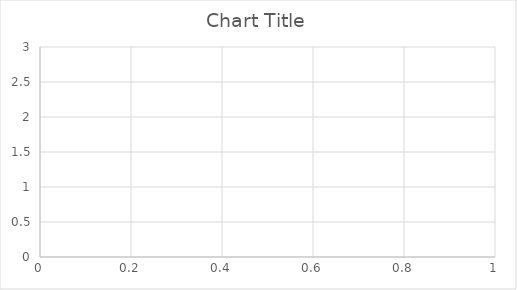
| Category | Series 0 |
|---|---|
| 0 | 2 |
| 1 | 2 |
| 2 | 2.333 |
| 3 | 2.25 |
| 4 | 2.4 |
| 5 | 2.167 |
| 6 | 2 |
| 7 | 2 |
| 8 | 1.889 |
| 9 | 1.8 |
| 10 | 1.909 |
| 11 | 1.917 |
| 12 | 1.846 |
| 13 | 1.786 |
| 14 | 1.733 |
| 15 | 1.688 |
| 16 | 1.647 |
| 17 | 1.611 |
| 18 | 1.579 |
| 19 | 1.6 |
| 20 | 1.667 |
| 21 | 1.636 |
| 22 | 1.696 |
| 23 | 1.667 |
| 24 | 1.64 |
| 25 | 1.615 |
| 26 | 1.593 |
| 27 | 1.571 |
| 28 | 1.552 |
| 29 | 1.533 |
| 30 | 1.516 |
| 31 | 1.5 |
| 32 | 1.485 |
| 33 | 1.471 |
| 34 | 1.486 |
| 35 | 1.5 |
| 36 | 1.541 |
| 37 | 1.526 |
| 38 | 1.564 |
| 39 | 1.575 |
| 40 | 1.61 |
| 41 | 1.619 |
| 42 | 1.628 |
| 43 | 1.636 |
| 44 | 1.622 |
| 45 | 1.652 |
| 46 | 1.638 |
| 47 | 1.625 |
| 48 | 1.633 |
| 49 | 1.64 |
| 50 | 1.627 |
| 51 | 1.615 |
| 52 | 1.604 |
| 53 | 1.611 |
| 54 | 1.636 |
| 55 | 1.643 |
| 56 | 1.649 |
| 57 | 1.638 |
| 58 | 1.644 |
| 59 | 1.633 |
| 60 | 1.656 |
| 61 | 1.645 |
| 62 | 1.635 |
| 63 | 1.641 |
| 64 | 1.631 |
| 65 | 1.621 |
| 66 | 1.612 |
| 67 | 1.632 |
| 68 | 1.638 |
| 69 | 1.629 |
| 70 | 1.62 |
| 71 | 1.611 |
| 72 | 1.603 |
| 73 | 1.595 |
| 74 | 1.613 |
| 75 | 1.632 |
| 76 | 1.623 |
| 77 | 1.615 |
| 78 | 1.633 |
| 79 | 1.638 |
| 80 | 1.63 |
| 81 | 1.646 |
| 82 | 1.663 |
| 83 | 1.679 |
| 84 | 1.671 |
| 85 | 1.674 |
| 86 | 1.678 |
| 87 | 1.682 |
| 88 | 1.697 |
| 89 | 1.7 |
| 90 | 1.692 |
| 91 | 1.685 |
| 92 | 1.677 |
| 93 | 1.691 |
| 94 | 1.705 |
| 95 | 1.698 |
| 96 | 1.691 |
| 97 | 1.684 |
| 98 | 1.687 |
| 99 | 1.68 |
| 100 | 1.673 |
| 101 | 1.667 |
| 102 | 1.66 |
| 103 | 1.654 |
| 104 | 1.667 |
| 105 | 1.67 |
| 106 | 1.664 |
| 107 | 1.667 |
| 108 | 1.67 |
| 109 | 1.664 |
| 110 | 1.658 |
| 111 | 1.661 |
| 112 | 1.664 |
| 113 | 1.658 |
| 114 | 1.661 |
| 115 | 1.655 |
| 116 | 1.65 |
| 117 | 1.644 |
| 118 | 1.639 |
| 119 | 1.65 |
| 120 | 1.645 |
| 121 | 1.656 |
| 122 | 1.65 |
| 123 | 1.645 |
| 124 | 1.64 |
| 125 | 1.635 |
| 126 | 1.646 |
| 127 | 1.656 |
| 128 | 1.659 |
| 129 | 1.669 |
| 130 | 1.664 |
| 131 | 1.674 |
| 132 | 1.677 |
| 133 | 1.679 |
| 134 | 1.674 |
| 135 | 1.684 |
| 136 | 1.686 |
| 137 | 1.681 |
| 138 | 1.676 |
| 139 | 1.671 |
| 140 | 1.667 |
| 141 | 1.662 |
| 142 | 1.657 |
| 143 | 1.653 |
| 144 | 1.655 |
| 145 | 1.664 |
| 146 | 1.667 |
| 147 | 1.662 |
| 148 | 1.658 |
| 149 | 1.653 |
| 150 | 1.662 |
| 151 | 1.658 |
| 152 | 1.654 |
| 153 | 1.662 |
| 154 | 1.665 |
| 155 | 1.673 |
| 156 | 1.669 |
| 157 | 1.671 |
| 158 | 1.679 |
| 159 | 1.681 |
| 160 | 1.683 |
| 161 | 1.691 |
| 162 | 1.687 |
| 163 | 1.689 |
| 164 | 1.697 |
| 165 | 1.693 |
| 166 | 1.701 |
| 167 | 1.696 |
| 168 | 1.698 |
| 169 | 1.694 |
| 170 | 1.69 |
| 171 | 1.692 |
| 172 | 1.694 |
| 173 | 1.69 |
| 174 | 1.686 |
| 175 | 1.688 |
| 176 | 1.695 |
| 177 | 1.702 |
| 178 | 1.704 |
| 179 | 1.711 |
| 180 | 1.707 |
| 181 | 1.714 |
| 182 | 1.716 |
| 183 | 1.712 |
| 184 | 1.719 |
| 185 | 1.726 |
| 186 | 1.733 |
| 187 | 1.739 |
| 188 | 1.746 |
| 189 | 1.742 |
| 190 | 1.738 |
| 191 | 1.745 |
| 192 | 1.746 |
| 193 | 1.753 |
| 194 | 1.754 |
| 195 | 1.755 |
| 196 | 1.751 |
| 197 | 1.753 |
| 198 | 1.754 |
| 199 | 1.75 |
| 200 | 1.746 |
| 201 | 1.752 |
| 202 | 1.754 |
| 203 | 1.75 |
| 204 | 1.746 |
| 205 | 1.748 |
| 206 | 1.749 |
| 207 | 1.75 |
| 208 | 1.751 |
| 209 | 1.748 |
| 210 | 1.749 |
| 211 | 1.75 |
| 212 | 1.746 |
| 213 | 1.743 |
| 214 | 1.74 |
| 215 | 1.745 |
| 216 | 1.751 |
| 217 | 1.757 |
| 218 | 1.753 |
| 219 | 1.75 |
| 220 | 1.756 |
| 221 | 1.752 |
| 222 | 1.749 |
| 223 | 1.75 |
| 224 | 1.747 |
| 225 | 1.748 |
| 226 | 1.749 |
| 227 | 1.746 |
| 228 | 1.747 |
| 229 | 1.752 |
| 230 | 1.753 |
| 231 | 1.759 |
| 232 | 1.76 |
| 233 | 1.765 |
| 234 | 1.762 |
| 235 | 1.763 |
| 236 | 1.768 |
| 237 | 1.765 |
| 238 | 1.762 |
| 239 | 1.762 |
| 240 | 1.759 |
| 241 | 1.764 |
| 242 | 1.765 |
| 243 | 1.766 |
| 244 | 1.767 |
| 245 | 1.768 |
| 246 | 1.769 |
| 247 | 1.766 |
| 248 | 1.771 |
| 249 | 1.772 |
| 250 | 1.777 |
| 251 | 1.782 |
| 252 | 1.783 |
| 253 | 1.783 |
| 254 | 1.78 |
| 255 | 1.777 |
| 256 | 1.782 |
| 257 | 1.787 |
| 258 | 1.784 |
| 259 | 1.781 |
| 260 | 1.785 |
| 261 | 1.79 |
| 262 | 1.791 |
| 263 | 1.795 |
| 264 | 1.796 |
| 265 | 1.797 |
| 266 | 1.794 |
| 267 | 1.799 |
| 268 | 1.796 |
| 269 | 1.793 |
| 270 | 1.79 |
| 271 | 1.794 |
| 272 | 1.795 |
| 273 | 1.796 |
| 274 | 1.793 |
| 275 | 1.79 |
| 276 | 1.791 |
| 277 | 1.791 |
| 278 | 1.792 |
| 279 | 1.789 |
| 280 | 1.79 |
| 281 | 1.787 |
| 282 | 1.788 |
| 283 | 1.792 |
| 284 | 1.796 |
| 285 | 1.794 |
| 286 | 1.791 |
| 287 | 1.792 |
| 288 | 1.792 |
| 289 | 1.79 |
| 290 | 1.794 |
| 291 | 1.798 |
| 292 | 1.799 |
| 293 | 1.796 |
| 294 | 1.793 |
| 295 | 1.794 |
| 296 | 1.795 |
| 297 | 1.795 |
| 298 | 1.793 |
| 299 | 1.79 |
| 300 | 1.791 |
| 301 | 1.788 |
| 302 | 1.789 |
| 303 | 1.789 |
| 304 | 1.787 |
| 305 | 1.784 |
| 306 | 1.782 |
| 307 | 1.782 |
| 308 | 1.786 |
| 309 | 1.79 |
| 310 | 1.791 |
| 311 | 1.792 |
| 312 | 1.789 |
| 313 | 1.79 |
| 314 | 1.79 |
| 315 | 1.788 |
| 316 | 1.785 |
| 317 | 1.786 |
| 318 | 1.784 |
| 319 | 1.781 |
| 320 | 1.782 |
| 321 | 1.78 |
| 322 | 1.777 |
| 323 | 1.775 |
| 324 | 1.775 |
| 325 | 1.773 |
| 326 | 1.771 |
| 327 | 1.771 |
| 328 | 1.772 |
| 329 | 1.773 |
| 330 | 1.773 |
| 331 | 1.771 |
| 332 | 1.775 |
| 333 | 1.775 |
| 334 | 1.773 |
| 335 | 1.774 |
| 336 | 1.772 |
| 337 | 1.769 |
| 338 | 1.77 |
| 339 | 1.768 |
| 340 | 1.765 |
| 341 | 1.766 |
| 342 | 1.77 |
| 343 | 1.767 |
| 344 | 1.765 |
| 345 | 1.766 |
| 346 | 1.764 |
| 347 | 1.761 |
| 348 | 1.762 |
| 349 | 1.76 |
| 350 | 1.758 |
| 351 | 1.759 |
| 352 | 1.762 |
| 353 | 1.76 |
| 354 | 1.763 |
| 355 | 1.767 |
| 356 | 1.768 |
| 357 | 1.768 |
| 358 | 1.766 |
| 359 | 1.764 |
| 360 | 1.767 |
| 361 | 1.765 |
| 362 | 1.766 |
| 363 | 1.769 |
| 364 | 1.767 |
| 365 | 1.768 |
| 366 | 1.768 |
| 367 | 1.766 |
| 368 | 1.764 |
| 369 | 1.765 |
| 370 | 1.763 |
| 371 | 1.761 |
| 372 | 1.761 |
| 373 | 1.762 |
| 374 | 1.765 |
| 375 | 1.769 |
| 376 | 1.769 |
| 377 | 1.772 |
| 378 | 1.773 |
| 379 | 1.774 |
| 380 | 1.777 |
| 381 | 1.775 |
| 382 | 1.773 |
| 383 | 1.773 |
| 384 | 1.771 |
| 385 | 1.769 |
| 386 | 1.767 |
| 387 | 1.771 |
| 388 | 1.769 |
| 389 | 1.767 |
| 390 | 1.765 |
| 391 | 1.765 |
| 392 | 1.768 |
| 393 | 1.772 |
| 394 | 1.77 |
| 395 | 1.77 |
| 396 | 1.768 |
| 397 | 1.769 |
| 398 | 1.769 |
| 399 | 1.768 |
| 400 | 1.768 |
| 401 | 1.769 |
| 402 | 1.767 |
| 403 | 1.767 |
| 404 | 1.765 |
| 405 | 1.764 |
| 406 | 1.764 |
| 407 | 1.767 |
| 408 | 1.768 |
| 409 | 1.766 |
| 410 | 1.764 |
| 411 | 1.762 |
| 412 | 1.763 |
| 413 | 1.761 |
| 414 | 1.759 |
| 415 | 1.757 |
| 416 | 1.755 |
| 417 | 1.754 |
| 418 | 1.752 |
| 419 | 1.75 |
| 420 | 1.748 |
| 421 | 1.749 |
| 422 | 1.749 |
| 423 | 1.75 |
| 424 | 1.748 |
| 425 | 1.746 |
| 426 | 1.749 |
| 427 | 1.75 |
| 428 | 1.748 |
| 429 | 1.749 |
| 430 | 1.747 |
| 431 | 1.75 |
| 432 | 1.748 |
| 433 | 1.747 |
| 434 | 1.747 |
| 435 | 1.745 |
| 436 | 1.746 |
| 437 | 1.744 |
| 438 | 1.743 |
| 439 | 1.745 |
| 440 | 1.744 |
| 441 | 1.742 |
| 442 | 1.743 |
| 443 | 1.745 |
| 444 | 1.744 |
| 445 | 1.742 |
| 446 | 1.74 |
| 447 | 1.739 |
| 448 | 1.742 |
| 449 | 1.74 |
| 450 | 1.738 |
| 451 | 1.737 |
| 452 | 1.74 |
| 453 | 1.738 |
| 454 | 1.738 |
| 455 | 1.737 |
| 456 | 1.737 |
| 457 | 1.74 |
| 458 | 1.739 |
| 459 | 1.739 |
| 460 | 1.738 |
| 461 | 1.738 |
| 462 | 1.737 |
| 463 | 1.739 |
| 464 | 1.742 |
| 465 | 1.74 |
| 466 | 1.739 |
| 467 | 1.739 |
| 468 | 1.742 |
| 469 | 1.745 |
| 470 | 1.743 |
| 471 | 1.742 |
| 472 | 1.74 |
| 473 | 1.741 |
| 474 | 1.743 |
| 475 | 1.746 |
| 476 | 1.744 |
| 477 | 1.743 |
| 478 | 1.743 |
| 479 | 1.742 |
| 480 | 1.742 |
| 481 | 1.741 |
| 482 | 1.741 |
| 483 | 1.74 |
| 484 | 1.738 |
| 485 | 1.739 |
| 486 | 1.739 |
| 487 | 1.738 |
| 488 | 1.738 |
| 489 | 1.739 |
| 490 | 1.737 |
| 491 | 1.738 |
| 492 | 1.736 |
| 493 | 1.737 |
| 494 | 1.735 |
| 495 | 1.734 |
| 496 | 1.734 |
| 497 | 1.737 |
| 498 | 1.735 |
| 499 | 1.738 |
| 500 | 1.737 |
| 501 | 1.739 |
| 502 | 1.738 |
| 503 | 1.74 |
| 504 | 1.739 |
| 505 | 1.737 |
| 506 | 1.738 |
| 507 | 1.738 |
| 508 | 1.739 |
| 509 | 1.739 |
| 510 | 1.742 |
| 511 | 1.744 |
| 512 | 1.743 |
| 513 | 1.741 |
| 514 | 1.74 |
| 515 | 1.738 |
| 516 | 1.737 |
| 517 | 1.737 |
| 518 | 1.74 |
| 519 | 1.738 |
| 520 | 1.737 |
| 521 | 1.736 |
| 522 | 1.736 |
| 523 | 1.735 |
| 524 | 1.733 |
| 525 | 1.736 |
| 526 | 1.734 |
| 527 | 1.735 |
| 528 | 1.733 |
| 529 | 1.736 |
| 530 | 1.738 |
| 531 | 1.739 |
| 532 | 1.741 |
| 533 | 1.743 |
| 534 | 1.742 |
| 535 | 1.743 |
| 536 | 1.741 |
| 537 | 1.74 |
| 538 | 1.742 |
| 539 | 1.743 |
| 540 | 1.743 |
| 541 | 1.744 |
| 542 | 1.746 |
| 543 | 1.744 |
| 544 | 1.743 |
| 545 | 1.742 |
| 546 | 1.742 |
| 547 | 1.741 |
| 548 | 1.741 |
| 549 | 1.74 |
| 550 | 1.74 |
| 551 | 1.741 |
| 552 | 1.74 |
| 553 | 1.742 |
| 554 | 1.742 |
| 555 | 1.741 |
| 556 | 1.741 |
| 557 | 1.74 |
| 558 | 1.739 |
| 559 | 1.738 |
| 560 | 1.736 |
| 561 | 1.737 |
| 562 | 1.739 |
| 563 | 1.739 |
| 564 | 1.738 |
| 565 | 1.74 |
| 566 | 1.739 |
| 567 | 1.738 |
| 568 | 1.736 |
| 569 | 1.735 |
| 570 | 1.737 |
| 571 | 1.736 |
| 572 | 1.738 |
| 573 | 1.737 |
| 574 | 1.736 |
| 575 | 1.736 |
| 576 | 1.735 |
| 577 | 1.734 |
| 578 | 1.732 |
| 579 | 1.733 |
| 580 | 1.733 |
| 581 | 1.732 |
| 582 | 1.731 |
| 583 | 1.729 |
| 584 | 1.732 |
| 585 | 1.73 |
| 586 | 1.729 |
| 587 | 1.731 |
| 588 | 1.732 |
| 589 | 1.731 |
| 590 | 1.733 |
| 591 | 1.731 |
| 592 | 1.732 |
| 593 | 1.731 |
| 594 | 1.729 |
| 595 | 1.73 |
| 596 | 1.729 |
| 597 | 1.729 |
| 598 | 1.73 |
| 599 | 1.732 |
| 600 | 1.732 |
| 601 | 1.733 |
| 602 | 1.733 |
| 603 | 1.733 |
| 604 | 1.734 |
| 605 | 1.733 |
| 606 | 1.731 |
| 607 | 1.73 |
| 608 | 1.729 |
| 609 | 1.73 |
| 610 | 1.728 |
| 611 | 1.73 |
| 612 | 1.732 |
| 613 | 1.731 |
| 614 | 1.733 |
| 615 | 1.735 |
| 616 | 1.736 |
| 617 | 1.738 |
| 618 | 1.737 |
| 619 | 1.739 |
| 620 | 1.738 |
| 621 | 1.736 |
| 622 | 1.735 |
| 623 | 1.734 |
| 624 | 1.734 |
| 625 | 1.733 |
| 626 | 1.734 |
| 627 | 1.732 |
| 628 | 1.731 |
| 629 | 1.73 |
| 630 | 1.731 |
| 631 | 1.729 |
| 632 | 1.731 |
| 633 | 1.732 |
| 634 | 1.732 |
| 635 | 1.733 |
| 636 | 1.733 |
| 637 | 1.734 |
| 638 | 1.732 |
| 639 | 1.733 |
| 640 | 1.733 |
| 641 | 1.734 |
| 642 | 1.733 |
| 643 | 1.731 |
| 644 | 1.732 |
| 645 | 1.732 |
| 646 | 1.731 |
| 647 | 1.731 |
| 648 | 1.73 |
| 649 | 1.731 |
| 650 | 1.731 |
| 651 | 1.732 |
| 652 | 1.73 |
| 653 | 1.732 |
| 654 | 1.733 |
| 655 | 1.735 |
| 656 | 1.735 |
| 657 | 1.737 |
| 658 | 1.739 |
| 659 | 1.738 |
| 660 | 1.737 |
| 661 | 1.736 |
| 662 | 1.735 |
| 663 | 1.735 |
| 664 | 1.735 |
| 665 | 1.736 |
| 666 | 1.735 |
| 667 | 1.735 |
| 668 | 1.737 |
| 669 | 1.736 |
| 670 | 1.735 |
| 671 | 1.734 |
| 672 | 1.736 |
| 673 | 1.736 |
| 674 | 1.736 |
| 675 | 1.737 |
| 676 | 1.736 |
| 677 | 1.737 |
| 678 | 1.736 |
| 679 | 1.735 |
| 680 | 1.734 |
| 681 | 1.735 |
| 682 | 1.734 |
| 683 | 1.732 |
| 684 | 1.734 |
| 685 | 1.736 |
| 686 | 1.738 |
| 687 | 1.737 |
| 688 | 1.737 |
| 689 | 1.738 |
| 690 | 1.74 |
| 691 | 1.74 |
| 692 | 1.742 |
| 693 | 1.742 |
| 694 | 1.741 |
| 695 | 1.741 |
| 696 | 1.742 |
| 697 | 1.742 |
| 698 | 1.744 |
| 699 | 1.744 |
| 700 | 1.745 |
| 701 | 1.745 |
| 702 | 1.744 |
| 703 | 1.744 |
| 704 | 1.745 |
| 705 | 1.744 |
| 706 | 1.743 |
| 707 | 1.742 |
| 708 | 1.74 |
| 709 | 1.739 |
| 710 | 1.74 |
| 711 | 1.739 |
| 712 | 1.739 |
| 713 | 1.738 |
| 714 | 1.738 |
| 715 | 1.737 |
| 716 | 1.736 |
| 717 | 1.735 |
| 718 | 1.736 |
| 719 | 1.738 |
| 720 | 1.739 |
| 721 | 1.74 |
| 722 | 1.74 |
| 723 | 1.739 |
| 724 | 1.738 |
| 725 | 1.737 |
| 726 | 1.736 |
| 727 | 1.735 |
| 728 | 1.734 |
| 729 | 1.733 |
| 730 | 1.732 |
| 731 | 1.731 |
| 732 | 1.733 |
| 733 | 1.732 |
| 734 | 1.732 |
| 735 | 1.731 |
| 736 | 1.73 |
| 737 | 1.729 |
| 738 | 1.728 |
| 739 | 1.73 |
| 740 | 1.729 |
| 741 | 1.728 |
| 742 | 1.728 |
| 743 | 1.728 |
| 744 | 1.73 |
| 745 | 1.729 |
| 746 | 1.73 |
| 747 | 1.729 |
| 748 | 1.728 |
| 749 | 1.729 |
| 750 | 1.728 |
| 751 | 1.729 |
| 752 | 1.729 |
| 753 | 1.729 |
| 754 | 1.728 |
| 755 | 1.728 |
| 756 | 1.727 |
| 757 | 1.727 |
| 758 | 1.726 |
| 759 | 1.726 |
| 760 | 1.725 |
| 761 | 1.726 |
| 762 | 1.725 |
| 763 | 1.724 |
| 764 | 1.723 |
| 765 | 1.723 |
| 766 | 1.722 |
| 767 | 1.723 |
| 768 | 1.722 |
| 769 | 1.721 |
| 770 | 1.721 |
| 771 | 1.72 |
| 772 | 1.719 |
| 773 | 1.718 |
| 774 | 1.717 |
| 775 | 1.719 |
| 776 | 1.718 |
| 777 | 1.719 |
| 778 | 1.718 |
| 779 | 1.717 |
| 780 | 1.716 |
| 781 | 1.717 |
| 782 | 1.716 |
| 783 | 1.716 |
| 784 | 1.716 |
| 785 | 1.716 |
| 786 | 1.717 |
| 787 | 1.716 |
| 788 | 1.715 |
| 789 | 1.715 |
| 790 | 1.717 |
| 791 | 1.716 |
| 792 | 1.715 |
| 793 | 1.715 |
| 794 | 1.717 |
| 795 | 1.716 |
| 796 | 1.715 |
| 797 | 1.714 |
| 798 | 1.713 |
| 799 | 1.712 |
| 800 | 1.713 |
| 801 | 1.713 |
| 802 | 1.715 |
| 803 | 1.714 |
| 804 | 1.714 |
| 805 | 1.715 |
| 806 | 1.714 |
| 807 | 1.714 |
| 808 | 1.716 |
| 809 | 1.715 |
| 810 | 1.714 |
| 811 | 1.714 |
| 812 | 1.713 |
| 813 | 1.713 |
| 814 | 1.712 |
| 815 | 1.711 |
| 816 | 1.712 |
| 817 | 1.711 |
| 818 | 1.712 |
| 819 | 1.712 |
| 820 | 1.711 |
| 821 | 1.71 |
| 822 | 1.71 |
| 823 | 1.711 |
| 824 | 1.71 |
| 825 | 1.709 |
| 826 | 1.71 |
| 827 | 1.71 |
| 828 | 1.709 |
| 829 | 1.71 |
| 830 | 1.71 |
| 831 | 1.709 |
| 832 | 1.708 |
| 833 | 1.71 |
| 834 | 1.709 |
| 835 | 1.711 |
| 836 | 1.712 |
| 837 | 1.711 |
| 838 | 1.712 |
| 839 | 1.712 |
| 840 | 1.712 |
| 841 | 1.713 |
| 842 | 1.712 |
| 843 | 1.711 |
| 844 | 1.71 |
| 845 | 1.712 |
| 846 | 1.711 |
| 847 | 1.71 |
| 848 | 1.71 |
| 849 | 1.709 |
| 850 | 1.709 |
| 851 | 1.709 |
| 852 | 1.71 |
| 853 | 1.712 |
| 854 | 1.711 |
| 855 | 1.71 |
| 856 | 1.709 |
| 857 | 1.709 |
| 858 | 1.708 |
| 859 | 1.708 |
| 860 | 1.707 |
| 861 | 1.708 |
| 862 | 1.708 |
| 863 | 1.707 |
| 864 | 1.708 |
| 865 | 1.709 |
| 866 | 1.709 |
| 867 | 1.71 |
| 868 | 1.709 |
| 869 | 1.708 |
| 870 | 1.708 |
| 871 | 1.708 |
| 872 | 1.708 |
| 873 | 1.707 |
| 874 | 1.706 |
| 875 | 1.707 |
| 876 | 1.708 |
| 877 | 1.707 |
| 878 | 1.708 |
| 879 | 1.707 |
| 880 | 1.708 |
| 881 | 1.707 |
| 882 | 1.709 |
| 883 | 1.71 |
| 884 | 1.712 |
| 885 | 1.713 |
| 886 | 1.714 |
| 887 | 1.713 |
| 888 | 1.712 |
| 889 | 1.711 |
| 890 | 1.712 |
| 891 | 1.711 |
| 892 | 1.712 |
| 893 | 1.711 |
| 894 | 1.711 |
| 895 | 1.712 |
| 896 | 1.711 |
| 897 | 1.71 |
| 898 | 1.711 |
| 899 | 1.712 |
| 900 | 1.711 |
| 901 | 1.711 |
| 902 | 1.71 |
| 903 | 1.709 |
| 904 | 1.708 |
| 905 | 1.71 |
| 906 | 1.71 |
| 907 | 1.71 |
| 908 | 1.711 |
| 909 | 1.711 |
| 910 | 1.711 |
| 911 | 1.711 |
| 912 | 1.71 |
| 913 | 1.709 |
| 914 | 1.708 |
| 915 | 1.71 |
| 916 | 1.71 |
| 917 | 1.709 |
| 918 | 1.709 |
| 919 | 1.709 |
| 920 | 1.709 |
| 921 | 1.71 |
| 922 | 1.711 |
| 923 | 1.71 |
| 924 | 1.709 |
| 925 | 1.708 |
| 926 | 1.708 |
| 927 | 1.707 |
| 928 | 1.708 |
| 929 | 1.708 |
| 930 | 1.708 |
| 931 | 1.708 |
| 932 | 1.707 |
| 933 | 1.708 |
| 934 | 1.707 |
| 935 | 1.706 |
| 936 | 1.708 |
| 937 | 1.707 |
| 938 | 1.706 |
| 939 | 1.707 |
| 940 | 1.709 |
| 941 | 1.709 |
| 942 | 1.709 |
| 943 | 1.709 |
| 944 | 1.709 |
| 945 | 1.708 |
| 946 | 1.707 |
| 947 | 1.708 |
| 948 | 1.707 |
| 949 | 1.707 |
| 950 | 1.708 |
| 951 | 1.707 |
| 952 | 1.706 |
| 953 | 1.705 |
| 954 | 1.705 |
| 955 | 1.705 |
| 956 | 1.706 |
| 957 | 1.707 |
| 958 | 1.706 |
| 959 | 1.707 |
| 960 | 1.707 |
| 961 | 1.706 |
| 962 | 1.705 |
| 963 | 1.705 |
| 964 | 1.705 |
| 965 | 1.705 |
| 966 | 1.704 |
| 967 | 1.704 |
| 968 | 1.705 |
| 969 | 1.704 |
| 970 | 1.705 |
| 971 | 1.705 |
| 972 | 1.705 |
| 973 | 1.705 |
| 974 | 1.706 |
| 975 | 1.705 |
| 976 | 1.704 |
| 977 | 1.703 |
| 978 | 1.703 |
| 979 | 1.702 |
| 980 | 1.701 |
| 981 | 1.701 |
| 982 | 1.701 |
| 983 | 1.702 |
| 984 | 1.703 |
| 985 | 1.702 |
| 986 | 1.703 |
| 987 | 1.702 |
| 988 | 1.703 |
| 989 | 1.702 |
| 990 | 1.702 |
| 991 | 1.704 |
| 992 | 1.703 |
| 993 | 1.703 |
| 994 | 1.704 |
| 995 | 1.705 |
| 996 | 1.704 |
| 997 | 1.704 |
| 998 | 1.704 |
| 999 | 1.704 |